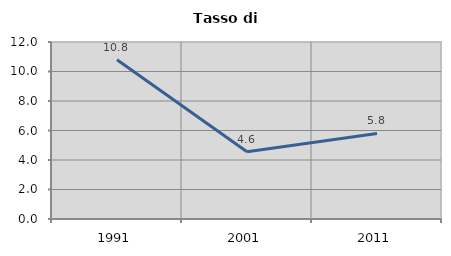
| Category | Tasso di disoccupazione   |
|---|---|
| 1991.0 | 10.802 |
| 2001.0 | 4.562 |
| 2011.0 | 5.797 |